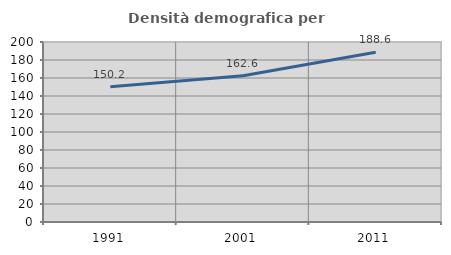
| Category | Densità demografica |
|---|---|
| 1991.0 | 150.225 |
| 2001.0 | 162.556 |
| 2011.0 | 188.598 |